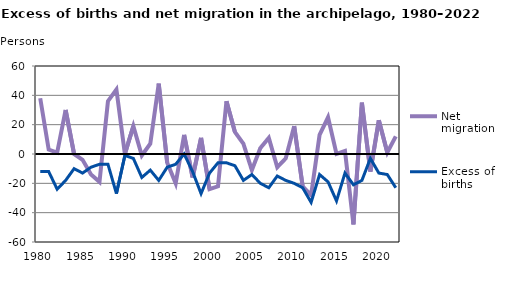
| Category | Net migration | Excess of births |
|---|---|---|
| 1980.0 | 38 | -12 |
| 1981.0 | 3 | -12 |
| 1982.0 | 1 | -24 |
| 1983.0 | 30 | -18 |
| 1984.0 | 0 | -10 |
| 1985.0 | -4 | -13 |
| 1986.0 | -14 | -9 |
| 1987.0 | -19 | -7 |
| 1988.0 | 36 | -7 |
| 1989.0 | 44 | -27 |
| 1990.0 | 0 | -1 |
| 1991.0 | 19 | -3 |
| 1992.0 | -1 | -16 |
| 1993.0 | 7 | -11 |
| 1994.0 | 48 | -18 |
| 1995.0 | -6 | -9 |
| 1996.0 | -20 | -7 |
| 1997.0 | 13 | 0 |
| 1998.0 | -16 | -12 |
| 1999.0 | 11 | -27 |
| 2000.0 | -24 | -13 |
| 2001.0 | -22 | -6 |
| 2002.0 | 36 | -6 |
| 2003.0 | 15 | -8 |
| 2004.0 | 7 | -18 |
| 2005.0 | -11 | -14 |
| 2006.0 | 4 | -20 |
| 2007.0 | 11 | -23 |
| 2008.0 | -9 | -15 |
| 2009.0 | -3 | -18 |
| 2010.0 | 19 | -20 |
| 2011.0 | -22 | -23 |
| 2012.0 | -28 | -33 |
| 2013.0 | 13 | -14 |
| 2014.0 | 25 | -19 |
| 2015.0 | 0 | -32 |
| 2016.0 | 2 | -13 |
| 2017.0 | -48 | -21 |
| 2018.0 | 35 | -18 |
| 2019.0 | -12 | -3 |
| 2020.0 | 23 | -13 |
| 2021.0 | 1 | -14 |
| 2022.0 | 12 | -23 |